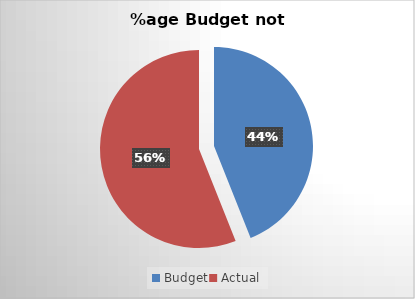
| Category | Series 0 |
|---|---|
| Budget | 1099.16 |
| Actual | 1400.84 |